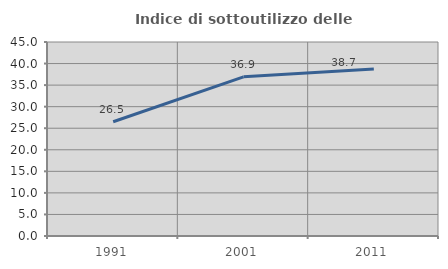
| Category | Indice di sottoutilizzo delle abitazioni  |
|---|---|
| 1991.0 | 26.502 |
| 2001.0 | 36.929 |
| 2011.0 | 38.713 |